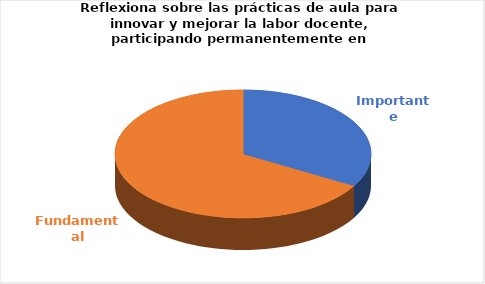
| Category | Series 0 |
|---|---|
| Importante | 5 |
| Fundamental | 10 |